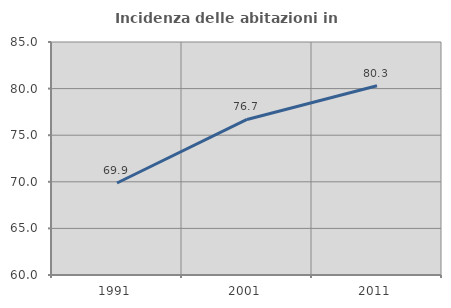
| Category | Incidenza delle abitazioni in proprietà  |
|---|---|
| 1991.0 | 69.873 |
| 2001.0 | 76.691 |
| 2011.0 | 80.304 |